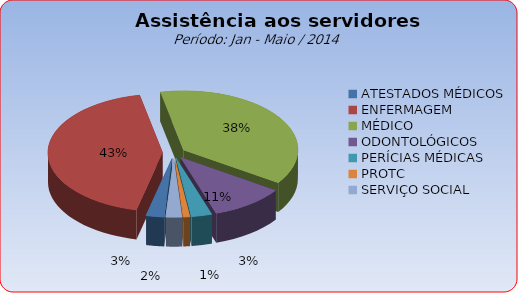
| Category | Series 0 |
|---|---|
| ATESTADOS MÉDICOS | 2.537 |
| ENFERMAGEM | 43.133 |
| MÉDICO | 37.686 |
| ODONTOLÓGICOS | 10.521 |
| PERÍCIAS MÉDICAS | 2.909 |
| PROTC | 0.947 |
| SERVIÇO SOCIAL | 2.267 |